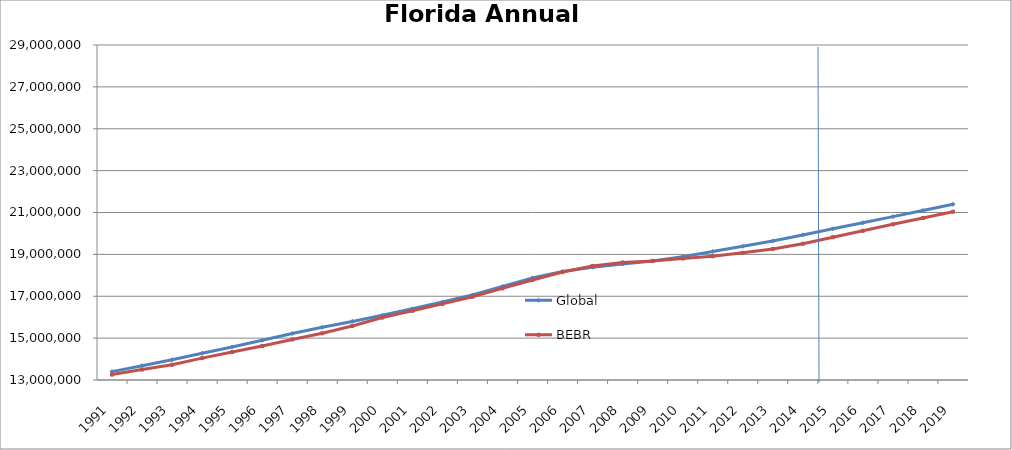
| Category | Global | BEBR |
|---|---|---|
| 1991-01-01 | 13400888.583 | 13258732 |
| 1992-01-01 | 13684434.034 | 13497541 |
| 1993-01-01 | 13967935.428 | 13730115 |
| 1994-01-01 | 14275382.794 | 14043757 |
| 1995-01-01 | 14577861.059 | 14335992 |
| 1996-01-01 | 14895506.854 | 14623421 |
| 1997-01-01 | 15221298.254 | 14938314 |
| 1998-01-01 | 15518556.221 | 15230421 |
| 1999-01-01 | 15798042.765 | 15580244 |
| 2000-01-01 | 16088978.056 | 15982824 |
| 2001-01-01 | 16399446.867 | 16305100 |
| 2002-01-01 | 16727125.504 | 16634256 |
| 2003-01-01 | 17060846.536 | 16979706 |
| 2004-01-01 | 17468830.749 | 17374824 |
| 2005-01-01 | 17875733.378 | 17778156 |
| 2006-01-01 | 18184081.858 | 18154475 |
| 2007-01-01 | 18385060.896 | 18446768 |
| 2008-01-01 | 18540761.091 | 18613905 |
| 2009-01-01 | 18682785.245 | 18687425 |
| 2010-01-01 | 18888260.75 | 18801332 |
| 2011-01-01 | 19138125.527 | 18905070 |
| 2012-01-01 | 19385501.633 | 19074434 |
| 2013-01-01 | 19639620.056 | 19259543 |
| 2014-01-01 | 19929392.636 | 19507369 |
| 2015-01-01 | 20220997.203 | 19817596 |
| 2016-01-01 | 20509577.018 | 20127723 |
| 2017-01-01 | 20801743.421 | 20434731 |
| 2018-01-01 | 21097166.279 | 20738328 |
| 2019-01-01 | 21391948.767 | 21039709 |